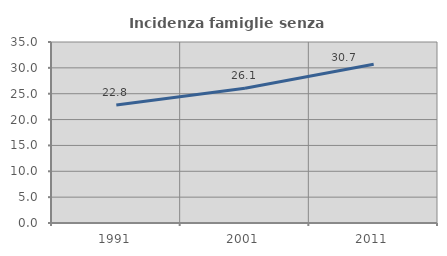
| Category | Incidenza famiglie senza nuclei |
|---|---|
| 1991.0 | 22.832 |
| 2001.0 | 26.056 |
| 2011.0 | 30.687 |